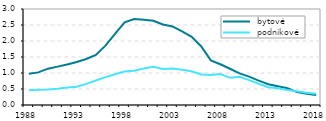
| Category |  bytové |  podnikové |
|---|---|---|
| 1988.0 | 0.973 | 0.464 |
| 1989.0 | 1.02 | 0.476 |
| 1990.0 | 1.136 | 0.488 |
| 1991.0 | 1.199 | 0.506 |
| 1992.0 | 1.264 | 0.55 |
| 1993.0 | 1.346 | 0.573 |
| 1994.0 | 1.437 | 0.659 |
| 1995.0 | 1.564 | 0.765 |
| 1996.0 | 1.856 | 0.871 |
| 1997.0 | 2.221 | 0.959 |
| 1998.0 | 2.584 | 1.045 |
| 1999.0 | 2.687 | 1.07 |
| 2000.0 | 2.663 | 1.14 |
| 2001.0 | 2.632 | 1.194 |
| 2002.0 | 2.516 | 1.127 |
| 2003.0 | 2.456 | 1.142 |
| 2004.0 | 2.298 | 1.1 |
| 2005.0 | 2.13 | 1.055 |
| 2006.0 | 1.828 | 0.951 |
| 2007.0 | 1.395 | 0.935 |
| 2008.0 | 1.273 | 0.969 |
| 2009.0 | 1.133 | 0.849 |
| 2010.0 | 0.989 | 0.882 |
| 2011.0 | 0.888 | 0.778 |
| 2012.0 | 0.763 | 0.664 |
| 2013.0 | 0.649 | 0.557 |
| 2014.0 | 0.589 | 0.521 |
| 2015.0 | 0.523 | 0.471 |
| 2016.0 | 0.403 | 0.429 |
| 2017.0 | 0.355 | 0.385 |
| 2018.0 | 0.311 | 0.354 |